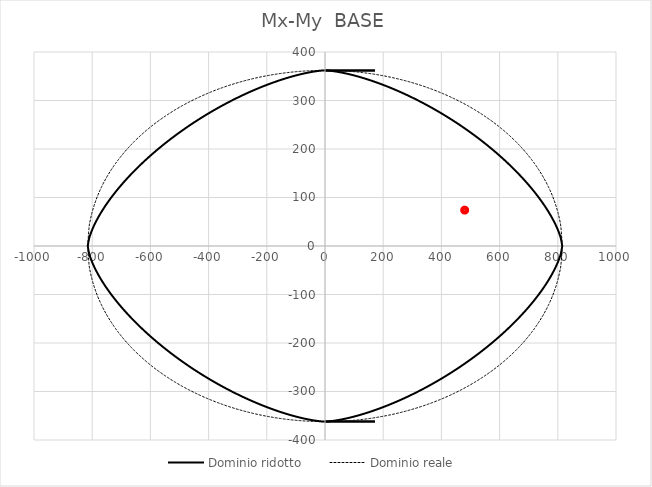
| Category | Series 2 |
|---|---|
| 480.0 | 74 |